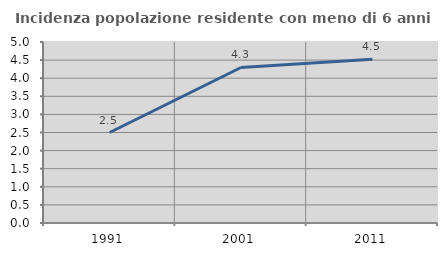
| Category | Incidenza popolazione residente con meno di 6 anni |
|---|---|
| 1991.0 | 2.5 |
| 2001.0 | 4.296 |
| 2011.0 | 4.524 |